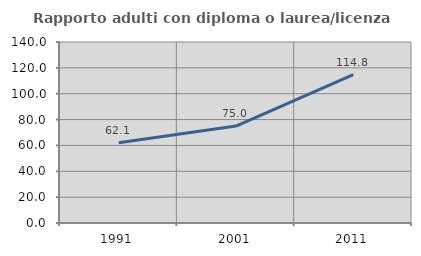
| Category | Rapporto adulti con diploma o laurea/licenza media  |
|---|---|
| 1991.0 | 62.13 |
| 2001.0 | 75 |
| 2011.0 | 114.765 |